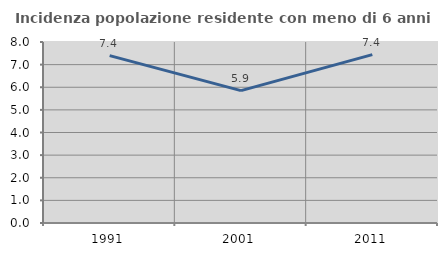
| Category | Incidenza popolazione residente con meno di 6 anni |
|---|---|
| 1991.0 | 7.4 |
| 2001.0 | 5.852 |
| 2011.0 | 7.444 |